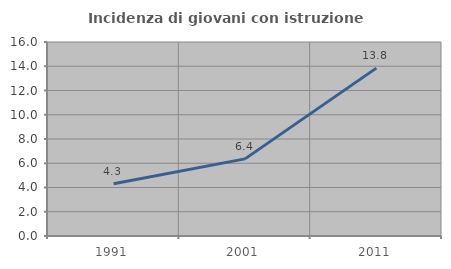
| Category | Incidenza di giovani con istruzione universitaria |
|---|---|
| 1991.0 | 4.308 |
| 2001.0 | 6.361 |
| 2011.0 | 13.846 |